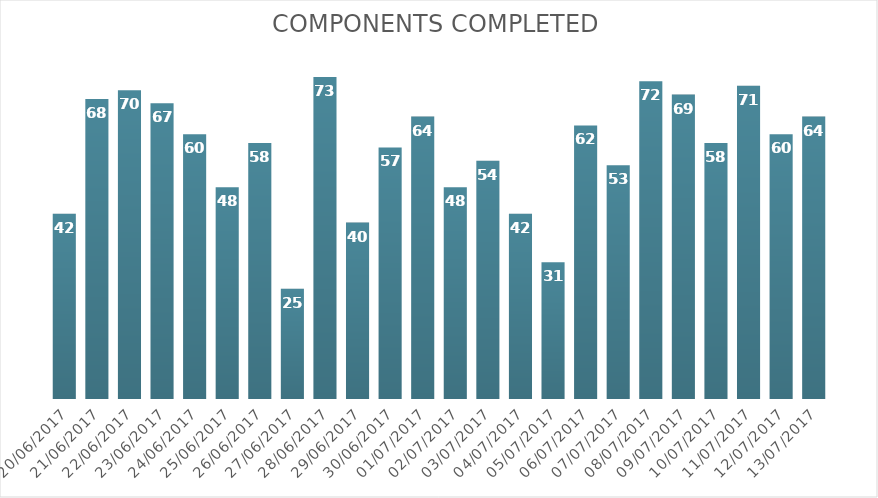
| Category | Components Completed |
|---|---|
| 20/06/2017 | 42 |
| 21/06/2017 | 68 |
| 22/06/2017 | 70 |
| 23/06/2017 | 67 |
| 24/06/2017 | 60 |
| 25/06/2017 | 48 |
| 26/06/2017 | 58 |
| 27/06/2017 | 25 |
| 28/06/2017 | 73 |
| 29/06/2017 | 40 |
| 30/06/2017 | 57 |
| 01/07/2017 | 64 |
| 02/07/2017 | 48 |
| 03/07/2017 | 54 |
| 04/07/2017 | 42 |
| 05/07/2017 | 31 |
| 06/07/2017 | 62 |
| 07/07/2017 | 53 |
| 08/07/2017 | 72 |
| 09/07/2017 | 69 |
| 10/07/2017 | 58 |
| 11/07/2017 | 71 |
| 12/07/2017 | 60 |
| 13/07/2017 | 64 |